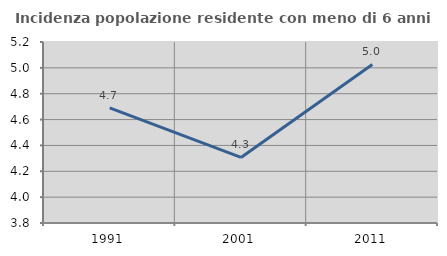
| Category | Incidenza popolazione residente con meno di 6 anni |
|---|---|
| 1991.0 | 4.69 |
| 2001.0 | 4.307 |
| 2011.0 | 5.026 |